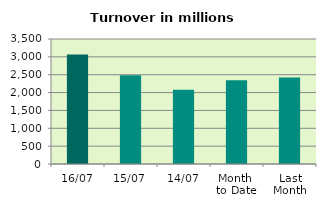
| Category | Series 0 |
|---|---|
| 16/07 | 3064.547 |
| 15/07 | 2488.354 |
| 14/07 | 2078.411 |
| Month 
to Date | 2342.756 |
| Last
Month | 2424.747 |